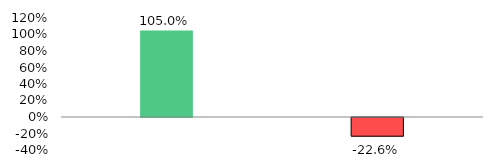
| Category | Series 1 |
|---|---|
| No of Current A/Cs Opened during Month | 1.05 |
| No of Current A/cs Opened Progressive | -0.226 |